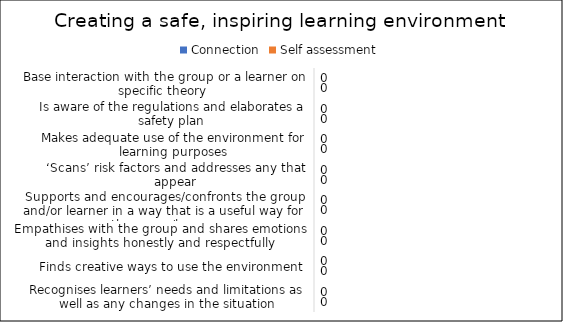
| Category | Connection | Self assessment |
|---|---|---|
| Base interaction with the group or a learner on specific theory  | 0 | 0 |
| Is aware of the regulations and elaborates a safety plan | 0 | 0 |
| Makes adequate use of the environment for learning purposes | 0 | 0 |
| ‘Scans’ risk factors and addresses any that appear | 0 | 0 |
| Supports and encourages/confronts the group and/or learner in a way that is a useful way for the group/learner | 0 | 0 |
| Empathises with the group and shares emotions and insights honestly and respectfully | 0 | 0 |
| Finds creative ways to use the environment | 0 | 0 |
| Recognises learners’ needs and limitations as well as any changes in the situation | 0 | 0 |